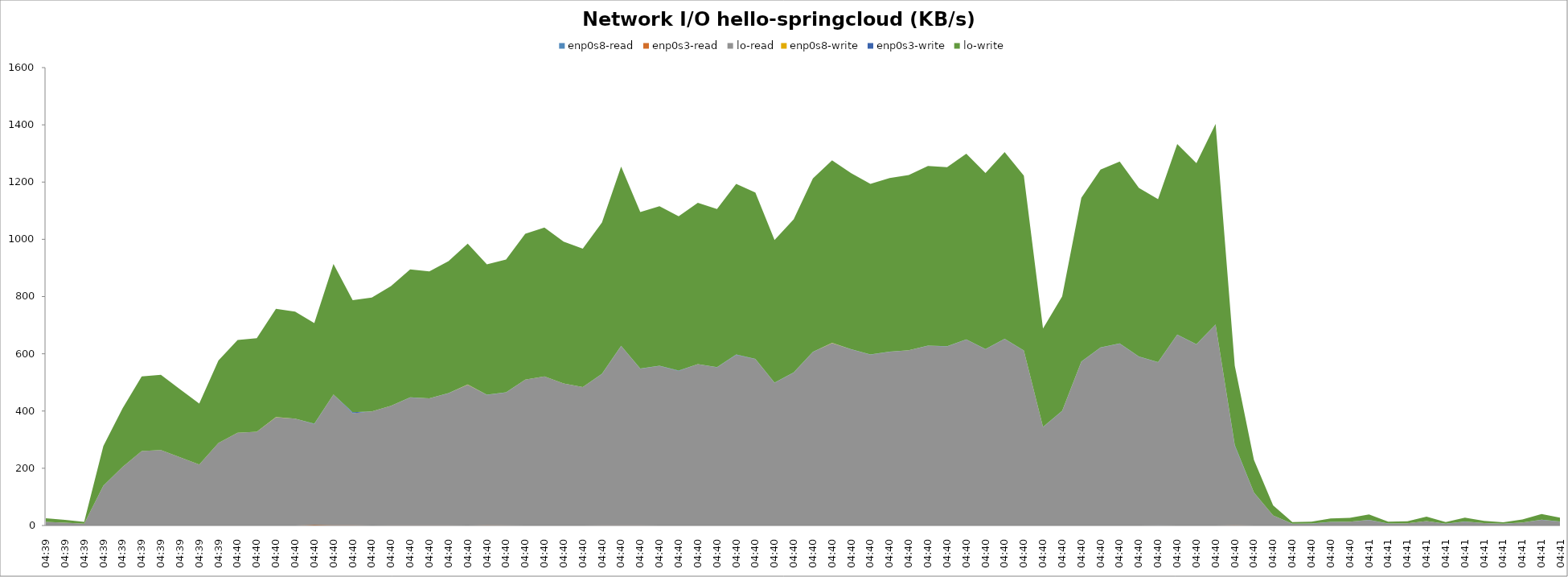
| Category | enp0s8-read | enp0s3-read | lo-read | enp0s8-write | enp0s3-write | lo-write |
|---|---|---|---|---|---|---|
| 04:39 | 0 | 0 | 12.8 | 0 | 0 | 12.8 |
| 04:39 | 0 | 0.1 | 9.9 | 0 | 0.1 | 9.9 |
| 04:39 | 0.1 | 0 | 6.2 | 0.1 | 0 | 6.2 |
| 04:39 | 0 | 0.1 | 138.7 | 0 | 0.2 | 138.7 |
| 04:39 | 0 | 0.1 | 204.4 | 0 | 0.1 | 204.4 |
| 04:39 | 0 | 0 | 260.4 | 0 | 0 | 260.4 |
| 04:39 | 0 | 0 | 263.4 | 0 | 0 | 263.4 |
| 04:39 | 0 | 0 | 238.1 | 0 | 0 | 238.1 |
| 04:39 | 0 | 0 | 212.9 | 0 | 0 | 212.9 |
| 04:39 | 0 | 0 | 288.4 | 0 | 0 | 288.4 |
| 04:40 | 0 | 0 | 324 | 0 | 0 | 324 |
| 04:40 | 0 | 0 | 327.4 | 0 | 0 | 327.4 |
| 04:40 | 0.1 | 0 | 378.4 | 0.1 | 0 | 378.4 |
| 04:40 | 0 | 0 | 373.6 | 0 | 0 | 373.6 |
| 04:40 | 0 | 2.7 | 351.4 | 0 | 1.8 | 351.4 |
| 04:40 | 0 | 1.1 | 456.2 | 0 | 0.3 | 456.2 |
| 04:40 | 0 | 1.1 | 391.4 | 0 | 3.1 | 391.4 |
| 04:40 | 0 | 0.1 | 398.2 | 0 | 0.1 | 398.2 |
| 04:40 | 0 | 0.4 | 417.9 | 0 | 0.3 | 417.9 |
| 04:40 | 0 | 0.7 | 446.7 | 0 | 0.5 | 446.7 |
| 04:40 | 0 | 0.5 | 443.5 | 0 | 0.4 | 443.5 |
| 04:40 | 0 | 0.4 | 461.6 | 0 | 0.4 | 461.6 |
| 04:40 | 0.1 | 0.1 | 492.2 | 0.2 | 0.1 | 492.2 |
| 04:40 | 0 | 1.1 | 455.4 | 0 | 0.7 | 455.4 |
| 04:40 | 0 | 0.6 | 464.1 | 0 | 0.6 | 464.1 |
| 04:40 | 0 | 0 | 509.7 | 0 | 0 | 509.7 |
| 04:40 | 0 | 0 | 520.7 | 0 | 0 | 520.7 |
| 04:40 | 0 | 0 | 496 | 0 | 0 | 496 |
| 04:40 | 0 | 0 | 483.5 | 0 | 0 | 483.5 |
| 04:40 | 0.1 | 0.3 | 529.1 | 0.1 | 0.2 | 529.1 |
| 04:40 | 0 | 0.9 | 626.4 | 0 | 0.5 | 626.4 |
| 04:40 | 0.1 | 0.7 | 547 | 0.1 | 0.5 | 547 |
| 04:40 | 0 | 0.2 | 557.5 | 0 | 0.5 | 557.5 |
| 04:40 | 0 | 0.2 | 539.8 | 0 | 1 | 539.8 |
| 04:40 | 0 | 0.1 | 563.4 | 0 | 0.6 | 563.4 |
| 04:40 | 0 | 0.1 | 552.7 | 0 | 0.6 | 552.7 |
| 04:40 | 0 | 0.2 | 596.2 | 0 | 0.8 | 596.2 |
| 04:40 | 0 | 0.1 | 581.4 | 0 | 0.5 | 581.4 |
| 04:40 | 0 | 0.2 | 498.2 | 0 | 0.7 | 498.2 |
| 04:40 | 0 | 0.1 | 534.5 | 0 | 0.5 | 534.5 |
| 04:40 | 0 | 0.1 | 606 | 0 | 0.5 | 606 |
| 04:40 | 0.1 | 0.1 | 637.7 | 0.1 | 0.5 | 637.7 |
| 04:40 | 0 | 0.1 | 615.2 | 0 | 0.5 | 615.2 |
| 04:40 | 0 | 0.1 | 596.7 | 0 | 0.5 | 596.7 |
| 04:40 | 0 | 0.1 | 606.9 | 0 | 0.5 | 606.9 |
| 04:40 | 0 | 0.1 | 611.9 | 0 | 0.5 | 611.9 |
| 04:40 | 0.1 | 0.1 | 627.6 | 0.1 | 0.5 | 627.6 |
| 04:40 | 0 | 0.1 | 625.7 | 0 | 0.6 | 625.7 |
| 04:40 | 0 | 0.2 | 649.1 | 0 | 0.7 | 649.1 |
| 04:40 | 0 | 0.2 | 615.4 | 0 | 0.7 | 615.4 |
| 04:40 | 0 | 0.2 | 651.8 | 0 | 0.7 | 651.8 |
| 04:40 | 0.1 | 0.1 | 610.8 | 0.1 | 0.6 | 610.8 |
| 04:40 | 0 | 0.2 | 343.5 | 0 | 0.7 | 343.5 |
| 04:40 | 0 | 0.2 | 399.9 | 0 | 0.7 | 399.9 |
| 04:40 | 0 | 0.2 | 572.2 | 0 | 0.6 | 572.2 |
| 04:40 | 0 | 0.2 | 621.2 | 0 | 0.7 | 621.2 |
| 04:40 | 0 | 0.2 | 635.5 | 0 | 0.6 | 635.5 |
| 04:40 | 0 | 0.2 | 589.4 | 0 | 0.6 | 589.4 |
| 04:40 | 0.6 | 0.1 | 569.3 | 0.2 | 0.6 | 569.3 |
| 04:40 | 0 | 0.2 | 666 | 0 | 0.6 | 666 |
| 04:40 | 0 | 0.2 | 632.7 | 0 | 0.7 | 632.7 |
| 04:40 | 0.1 | 0.1 | 701.2 | 0.1 | 0.5 | 701.2 |
| 04:40 | 0 | 1.4 | 276.9 | 0 | 2.7 | 276.9 |
| 04:40 | 0 | 0.1 | 114.4 | 0 | 0.6 | 114.4 |
| 04:40 | 0 | 0.2 | 34.7 | 0 | 0.6 | 34.7 |
| 04:40 | 0 | 0.2 | 5.6 | 0 | 0.6 | 5.6 |
| 04:40 | 0 | 0.1 | 6.5 | 0 | 0.4 | 6.5 |
| 04:40 | 0.1 | 0.2 | 11.7 | 0.1 | 0.5 | 11.7 |
| 04:40 | 0 | 0.1 | 13 | 0 | 0.4 | 13 |
| 04:41 | 0 | 0.2 | 18.9 | 0 | 0.6 | 18.9 |
| 04:41 | 0 | 0.2 | 6.4 | 0 | 0.6 | 6.4 |
| 04:41 | 0.1 | 0.2 | 7.1 | 0.1 | 0.5 | 7.1 |
| 04:41 | 0 | 0.1 | 15.1 | 0 | 0.4 | 15.1 |
| 04:41 | 0 | 0.2 | 5.5 | 0 | 0.5 | 5.5 |
| 04:41 | 0 | 0.2 | 13.3 | 0 | 0.5 | 13.3 |
| 04:41 | 0 | 0.2 | 7.9 | 0 | 0.5 | 7.9 |
| 04:41 | 0 | 0.2 | 5.3 | 0 | 0.5 | 5.3 |
| 04:41 | 0 | 0.2 | 10.1 | 0 | 0.5 | 10.1 |
| 04:41 | 0 | 0.2 | 19.7 | 0 | 0.6 | 19.7 |
| 04:41 | 0 | 0.2 | 13.1 | 0 | 0.6 | 13.1 |